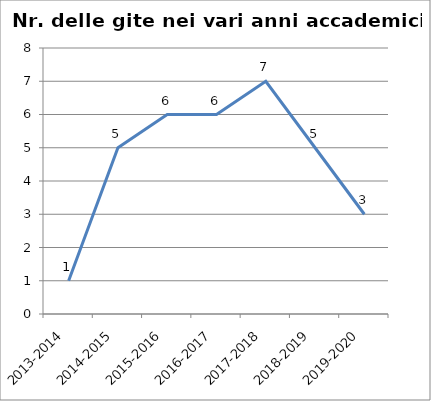
| Category | Nr. Gite Svolte |
|---|---|
| 2013-2014 | 1 |
| 2014-2015 | 5 |
| 2015-2016 | 6 |
| 2016-2017 | 6 |
| 2017-2018 | 7 |
| 2018-2019 | 5 |
| 2019-2020 | 3 |